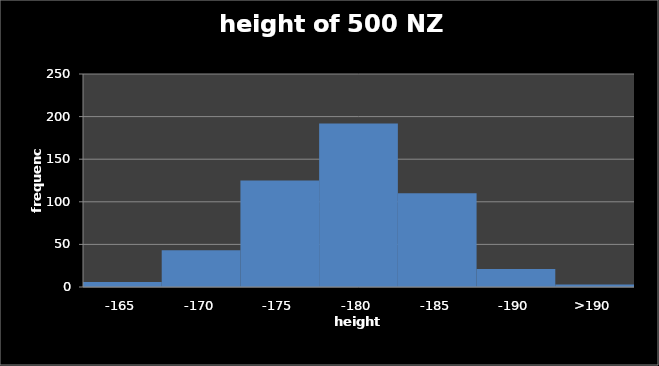
| Category | sample 30 |
|---|---|
| -165 | 6 |
| -170 | 43 |
| -175 | 125 |
| -180 | 192 |
| -185 | 110 |
| -190 | 21 |
| >190 | 3 |